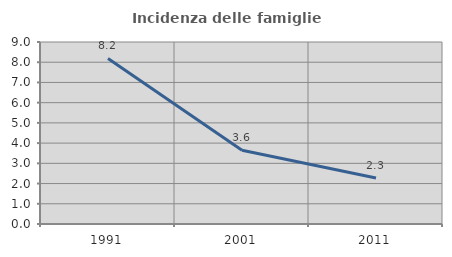
| Category | Incidenza delle famiglie numerose |
|---|---|
| 1991.0 | 8.188 |
| 2001.0 | 3.647 |
| 2011.0 | 2.276 |